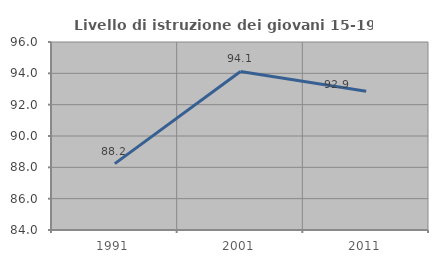
| Category | Livello di istruzione dei giovani 15-19 anni |
|---|---|
| 1991.0 | 88.235 |
| 2001.0 | 94.118 |
| 2011.0 | 92.857 |